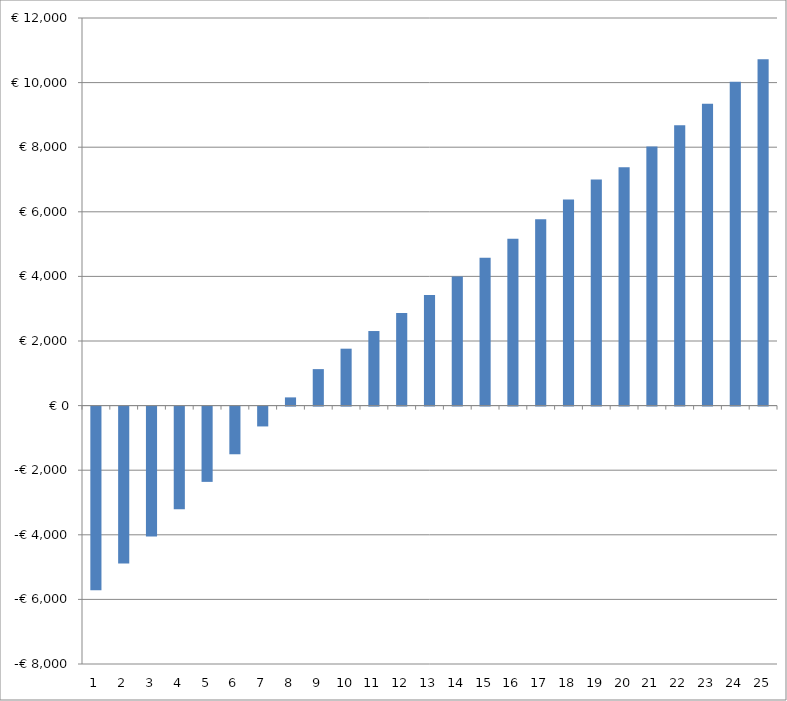
| Category | Series 0 |
|---|---|
| 0 | -5685.686 |
| 1 | -4859.726 |
| 2 | -4022.594 |
| 3 | -3179.598 |
| 4 | -2330.711 |
| 5 | -1475.656 |
| 6 | -614.145 |
| 7 | 254.117 |
| 8 | 1129.432 |
| 9 | 1762.11 |
| 10 | 2308.722 |
| 11 | 2863.347 |
| 12 | 3426.322 |
| 13 | 3997.995 |
| 14 | 4578.723 |
| 15 | 5168.873 |
| 16 | 5768.823 |
| 17 | 6378.962 |
| 18 | 6999.69 |
| 19 | 7381.418 |
| 20 | 8024.568 |
| 21 | 8679.576 |
| 22 | 9346.889 |
| 23 | 10026.969 |
| 24 | 10720.29 |